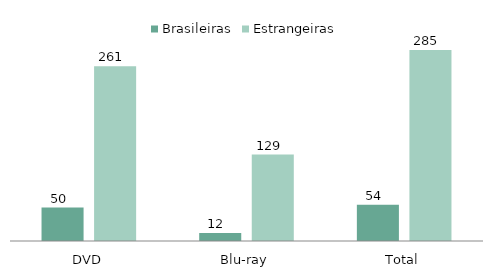
| Category | Brasileiras | Estrangeiras |
|---|---|---|
| DVD | 50 | 261 |
| Blu-ray | 12 | 129 |
| Total | 54 | 285 |